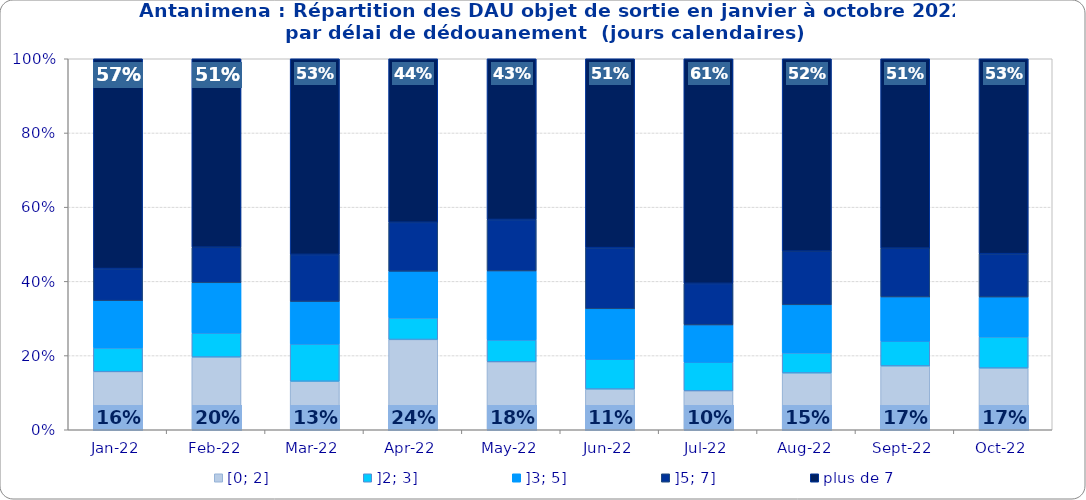
| Category | [0; 2] | ]2; 3] | ]3; 5] | ]5; 7] | plus de 7 |
|---|---|---|---|---|---|
| 2022-01-01 | 0.157 | 0.064 | 0.127 | 0.087 | 0.566 |
| 2022-02-01 | 0.196 | 0.065 | 0.136 | 0.096 | 0.508 |
| 2022-03-01 | 0.131 | 0.1 | 0.115 | 0.127 | 0.527 |
| 2022-04-01 | 0.243 | 0.058 | 0.126 | 0.132 | 0.441 |
| 2022-05-01 | 0.183 | 0.059 | 0.186 | 0.139 | 0.433 |
| 2022-06-01 | 0.11 | 0.08 | 0.136 | 0.165 | 0.509 |
| 2022-07-01 | 0.105 | 0.077 | 0.101 | 0.112 | 0.606 |
| 2022-08-01 | 0.153 | 0.054 | 0.13 | 0.145 | 0.519 |
| 2022-09-01 | 0.172 | 0.067 | 0.119 | 0.131 | 0.511 |
| 2022-10-01 | 0.166 | 0.084 | 0.107 | 0.117 | 0.525 |